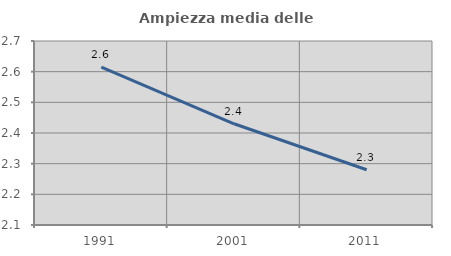
| Category | Ampiezza media delle famiglie |
|---|---|
| 1991.0 | 2.615 |
| 2001.0 | 2.43 |
| 2011.0 | 2.28 |